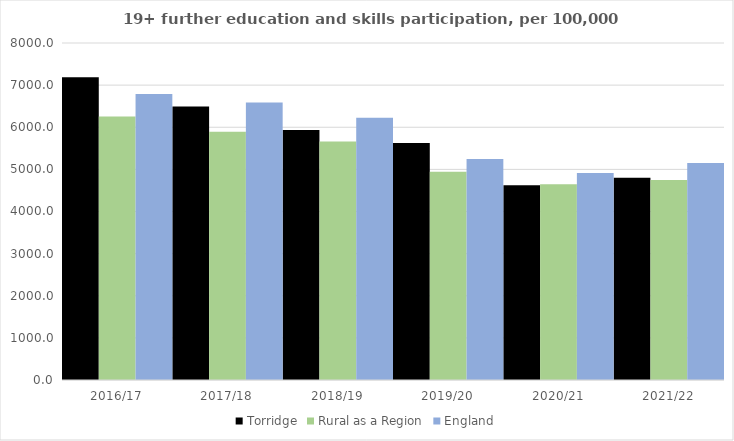
| Category | Torridge | Rural as a Region | England |
|---|---|---|---|
| 2016/17 | 7187 | 6253.401 | 6788 |
| 2017/18 | 6490 | 5892.029 | 6588 |
| 2018/19 | 5932 | 5661.873 | 6227 |
| 2019/20 | 5626 | 4943.801 | 5244 |
| 2020/21 | 4625 | 4646.727 | 4913 |
| 2021/22 | 4801 | 4747.049 | 5151 |